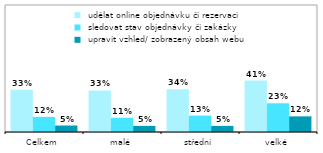
| Category |  udělat online objednávku či rezervaci |  sledovat stav objednávky či zakázky |  upravit vzhled/ zobrazený obsah webu |
|---|---|---|---|
| Celkem | 0.332 | 0.119 | 0.051 |
| malé | 0.327 | 0.112 | 0.048 |
| střední | 0.337 | 0.129 | 0.048 |
| velké | 0.405 | 0.226 | 0.123 |